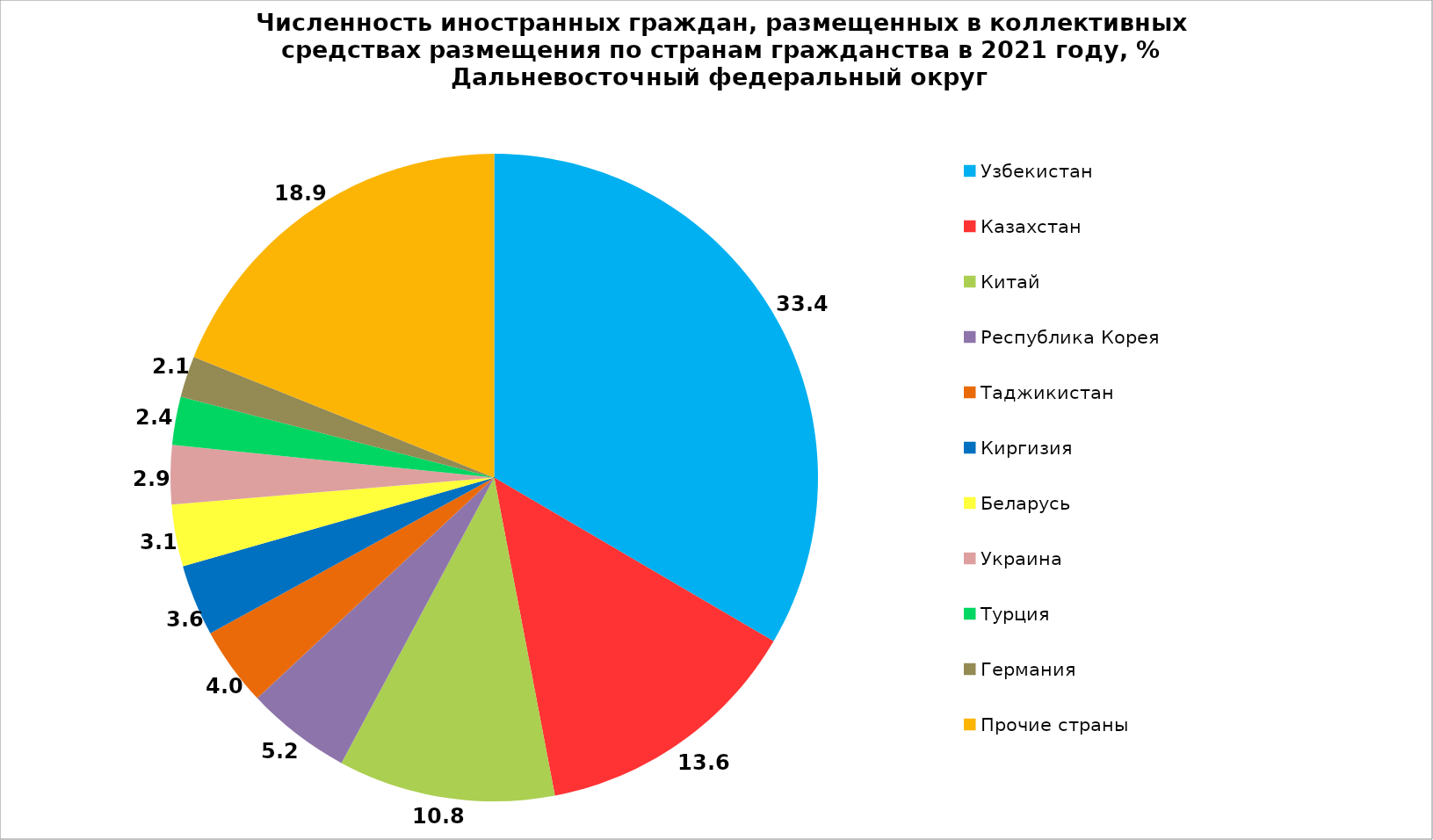
| Category | Series 0 |
|---|---|
| Узбекистан | 33.431 |
| Казахстан | 13.567 |
| Китай | 10.825 |
| Республика Корея | 5.246 |
| Таджикистан | 3.95 |
| Киргизия | 3.561 |
| Беларусь | 3.09 |
| Украина | 2.944 |
| Турция | 2.401 |
| Германия | 2.064 |
| Прочие страны | 18.92 |